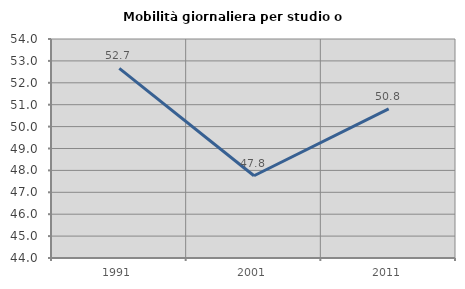
| Category | Mobilità giornaliera per studio o lavoro |
|---|---|
| 1991.0 | 52.66 |
| 2001.0 | 47.755 |
| 2011.0 | 50.813 |